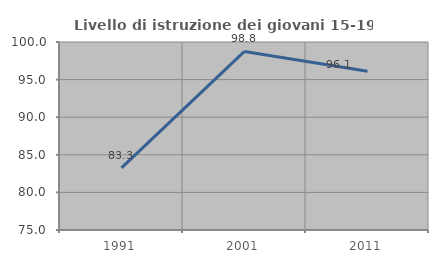
| Category | Livello di istruzione dei giovani 15-19 anni |
|---|---|
| 1991.0 | 83.254 |
| 2001.0 | 98.75 |
| 2011.0 | 96.117 |